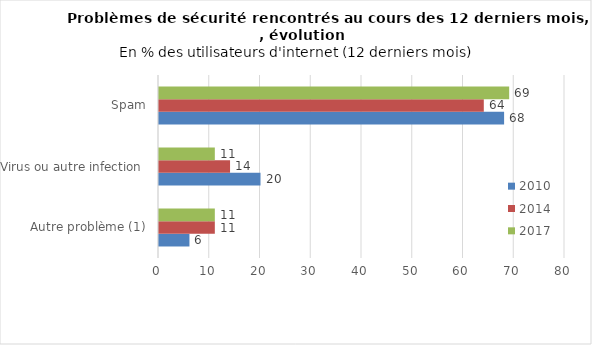
| Category | 2010 | 2014 | 2017 |
|---|---|---|---|
| Autre problème (1) | 6 | 11 | 11 |
| Virus ou autre infection  | 20 | 14 | 11 |
| Spam | 68 | 64 | 69 |